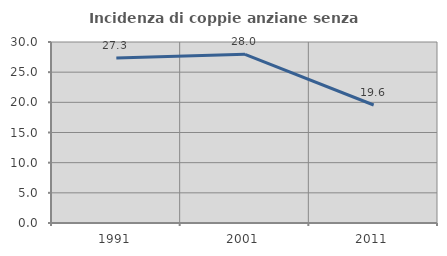
| Category | Incidenza di coppie anziane senza figli  |
|---|---|
| 1991.0 | 27.331 |
| 2001.0 | 27.961 |
| 2011.0 | 19.557 |